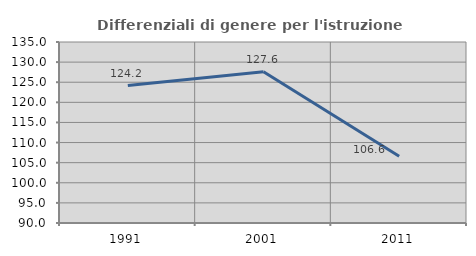
| Category | Differenziali di genere per l'istruzione superiore |
|---|---|
| 1991.0 | 124.156 |
| 2001.0 | 127.621 |
| 2011.0 | 106.594 |